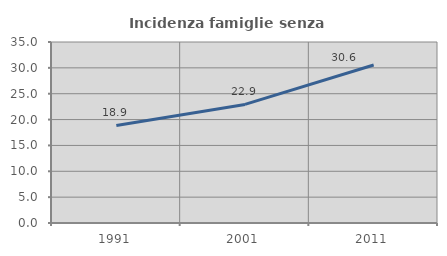
| Category | Incidenza famiglie senza nuclei |
|---|---|
| 1991.0 | 18.865 |
| 2001.0 | 22.934 |
| 2011.0 | 30.555 |